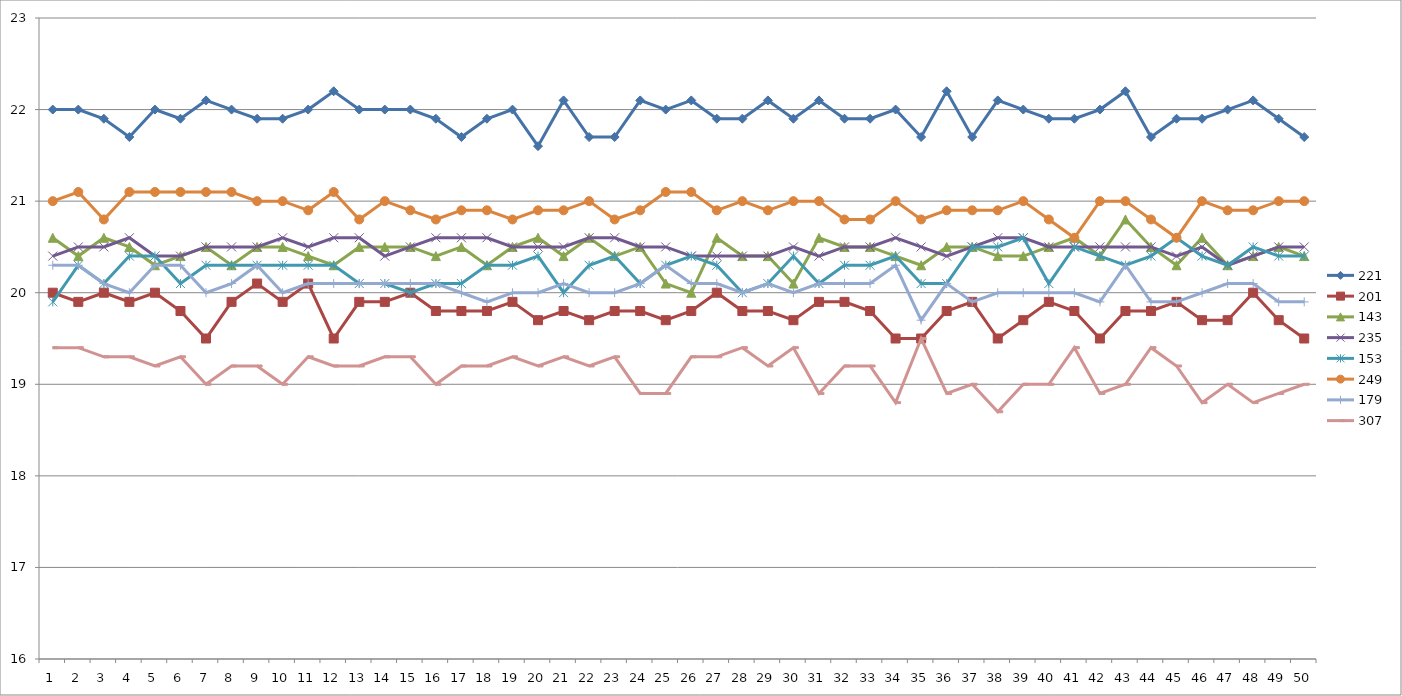
| Category | 221 | 201 | 143 | 235 | 153 | 249 | 179 | 307 |
|---|---|---|---|---|---|---|---|---|
| 0 | 22 | 20 | 20.6 | 20.4 | 19.9 | 21 | 20.3 | 19.4 |
| 1 | 22 | 19.9 | 20.4 | 20.5 | 20.3 | 21.1 | 20.3 | 19.4 |
| 2 | 21.9 | 20 | 20.6 | 20.5 | 20.1 | 20.8 | 20.1 | 19.3 |
| 3 | 21.7 | 19.9 | 20.5 | 20.6 | 20.4 | 21.1 | 20 | 19.3 |
| 4 | 22 | 20 | 20.3 | 20.4 | 20.4 | 21.1 | 20.3 | 19.2 |
| 5 | 21.9 | 19.8 | 20.4 | 20.4 | 20.1 | 21.1 | 20.3 | 19.3 |
| 6 | 22.1 | 19.5 | 20.5 | 20.5 | 20.3 | 21.1 | 20 | 19 |
| 7 | 22 | 19.9 | 20.3 | 20.5 | 20.3 | 21.1 | 20.1 | 19.2 |
| 8 | 21.9 | 20.1 | 20.5 | 20.5 | 20.3 | 21 | 20.3 | 19.2 |
| 9 | 21.9 | 19.9 | 20.5 | 20.6 | 20.3 | 21 | 20 | 19 |
| 10 | 22 | 20.1 | 20.4 | 20.5 | 20.3 | 20.9 | 20.1 | 19.3 |
| 11 | 22.2 | 19.5 | 20.3 | 20.6 | 20.3 | 21.1 | 20.1 | 19.2 |
| 12 | 22 | 19.9 | 20.5 | 20.6 | 20.1 | 20.8 | 20.1 | 19.2 |
| 13 | 22 | 19.9 | 20.5 | 20.4 | 20.1 | 21 | 20.1 | 19.3 |
| 14 | 22 | 20 | 20.5 | 20.5 | 20 | 20.9 | 20.1 | 19.3 |
| 15 | 21.9 | 19.8 | 20.4 | 20.6 | 20.1 | 20.8 | 20.1 | 19 |
| 16 | 21.7 | 19.8 | 20.5 | 20.6 | 20.1 | 20.9 | 20 | 19.2 |
| 17 | 21.9 | 19.8 | 20.3 | 20.6 | 20.3 | 20.9 | 19.9 | 19.2 |
| 18 | 22 | 19.9 | 20.5 | 20.5 | 20.3 | 20.8 | 20 | 19.3 |
| 19 | 21.6 | 19.7 | 20.6 | 20.5 | 20.4 | 20.9 | 20 | 19.2 |
| 20 | 22.1 | 19.8 | 20.4 | 20.5 | 20 | 20.9 | 20.1 | 19.3 |
| 21 | 21.7 | 19.7 | 20.6 | 20.6 | 20.3 | 21 | 20 | 19.2 |
| 22 | 21.7 | 19.8 | 20.4 | 20.6 | 20.4 | 20.8 | 20 | 19.3 |
| 23 | 22.1 | 19.8 | 20.5 | 20.5 | 20.1 | 20.9 | 20.1 | 18.9 |
| 24 | 22 | 19.7 | 20.1 | 20.5 | 20.3 | 21.1 | 20.3 | 18.9 |
| 25 | 22.1 | 19.8 | 20 | 20.4 | 20.4 | 21.1 | 20.1 | 19.3 |
| 26 | 21.9 | 20 | 20.6 | 20.4 | 20.3 | 20.9 | 20.1 | 19.3 |
| 27 | 21.9 | 19.8 | 20.4 | 20.4 | 20 | 21 | 20 | 19.4 |
| 28 | 22.1 | 19.8 | 20.4 | 20.4 | 20.1 | 20.9 | 20.1 | 19.2 |
| 29 | 21.9 | 19.7 | 20.1 | 20.5 | 20.4 | 21 | 20 | 19.4 |
| 30 | 22.1 | 19.9 | 20.6 | 20.4 | 20.1 | 21 | 20.1 | 18.9 |
| 31 | 21.9 | 19.9 | 20.5 | 20.5 | 20.3 | 20.8 | 20.1 | 19.2 |
| 32 | 21.9 | 19.8 | 20.5 | 20.5 | 20.3 | 20.8 | 20.1 | 19.2 |
| 33 | 22 | 19.5 | 20.4 | 20.6 | 20.4 | 21 | 20.3 | 18.8 |
| 34 | 21.7 | 19.5 | 20.3 | 20.5 | 20.1 | 20.8 | 19.7 | 19.5 |
| 35 | 22.2 | 19.8 | 20.5 | 20.4 | 20.1 | 20.9 | 20.1 | 18.9 |
| 36 | 21.7 | 19.9 | 20.5 | 20.5 | 20.5 | 20.9 | 19.9 | 19 |
| 37 | 22.1 | 19.5 | 20.4 | 20.6 | 20.5 | 20.9 | 20 | 18.7 |
| 38 | 22 | 19.7 | 20.4 | 20.6 | 20.6 | 21 | 20 | 19 |
| 39 | 21.9 | 19.9 | 20.5 | 20.5 | 20.1 | 20.8 | 20 | 19 |
| 40 | 21.9 | 19.8 | 20.6 | 20.5 | 20.5 | 20.6 | 20 | 19.4 |
| 41 | 22 | 19.5 | 20.4 | 20.5 | 20.4 | 21 | 19.9 | 18.9 |
| 42 | 22.2 | 19.8 | 20.8 | 20.5 | 20.3 | 21 | 20.3 | 19 |
| 43 | 21.7 | 19.8 | 20.5 | 20.5 | 20.4 | 20.8 | 19.9 | 19.4 |
| 44 | 21.9 | 19.9 | 20.3 | 20.4 | 20.6 | 20.6 | 19.9 | 19.2 |
| 45 | 21.9 | 19.7 | 20.6 | 20.5 | 20.4 | 21 | 20 | 18.8 |
| 46 | 22 | 19.7 | 20.3 | 20.3 | 20.3 | 20.9 | 20.1 | 19 |
| 47 | 22.1 | 20 | 20.4 | 20.4 | 20.5 | 20.9 | 20.1 | 18.8 |
| 48 | 21.9 | 19.7 | 20.5 | 20.5 | 20.4 | 21 | 19.9 | 18.9 |
| 49 | 21.7 | 19.5 | 20.4 | 20.5 | 20.4 | 21 | 19.9 | 19 |